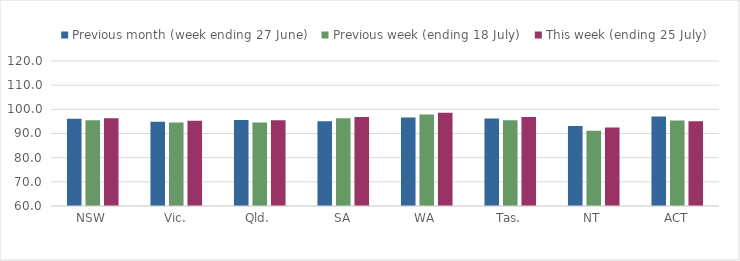
| Category | Previous month (week ending 27 June) | Previous week (ending 18 July) | This week (ending 25 July) |
|---|---|---|---|
| NSW | 96.111 | 95.507 | 96.33 |
| Vic. | 94.913 | 94.567 | 95.3 |
| Qld. | 95.554 | 94.574 | 95.469 |
| SA | 95.037 | 96.261 | 96.829 |
| WA | 96.638 | 97.858 | 98.569 |
| Tas. | 96.219 | 95.449 | 96.785 |
| NT | 93.059 | 91.186 | 92.477 |
| ACT | 97.03 | 95.421 | 95.117 |